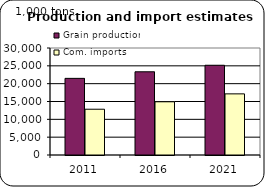
| Category | Grain production | Com. imports |
|---|---|---|
| 2011.0 | 21487.605 | 12833.737 |
| 2016.0 | 23328.197 | 14924.203 |
| 2021.0 | 25160.337 | 17139.997 |